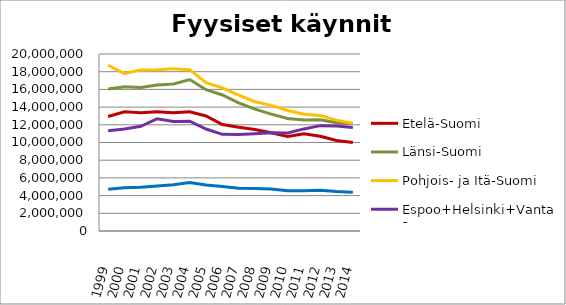
| Category | Etelä-Suomi | Länsi-Suomi | Pohjois- ja Itä-Suomi | Espoo+Helsinki+Vantaa | Muu Uusimaa |
|---|---|---|---|---|---|
| 1999.0 | 12941801 | 16057909 | 18724870 | 11319016 | 4721235 |
| 2000.0 | 13475253 | 16297341 | 17789986 | 11516867 | 4898727 |
| 2001.0 | 13364527 | 16222073 | 18204794 | 11829106 | 4937628 |
| 2002.0 | 13476868 | 16504458 | 18230885 | 12688244 | 5072673 |
| 2003.0 | 13350855 | 16606654 | 18346717 | 12369928 | 5232294 |
| 2004.0 | 13473820 | 17113522 | 18229559 | 12399183 | 5489802 |
| 2005.0 | 13001361 | 15960809 | 16767609 | 11523818 | 5187791 |
| 2006.0 | 12031153 | 15369704 | 16164756 | 10923344 | 5036932 |
| 2007.0 | 11717197 | 14475670 | 15365616 | 10891090 | 4822614 |
| 2008.0 | 11467665 | 13762460 | 14605814 | 10976937 | 4793506 |
| 2009.0 | 11095475 | 13204250 | 14190957 | 11096632 | 4732144 |
| 2010.0 | 10676262 | 12713486 | 13620080 | 11085264 | 4552164 |
| 2011.0 | 10976798 | 12538723 | 13187088 | 11535282 | 4559111 |
| 2012.0 | 10712835 | 12570710 | 13043587 | 11903675 | 4607626 |
| 2013.0 | 10227626 | 12225812 | 12528236 | 11860169 | 4451434 |
| 2014.0 | 10007763 | 12133843.5 | 12165749 | 11703546 | 4368418 |